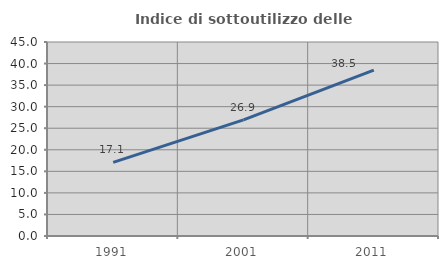
| Category | Indice di sottoutilizzo delle abitazioni  |
|---|---|
| 1991.0 | 17.071 |
| 2001.0 | 26.923 |
| 2011.0 | 38.468 |